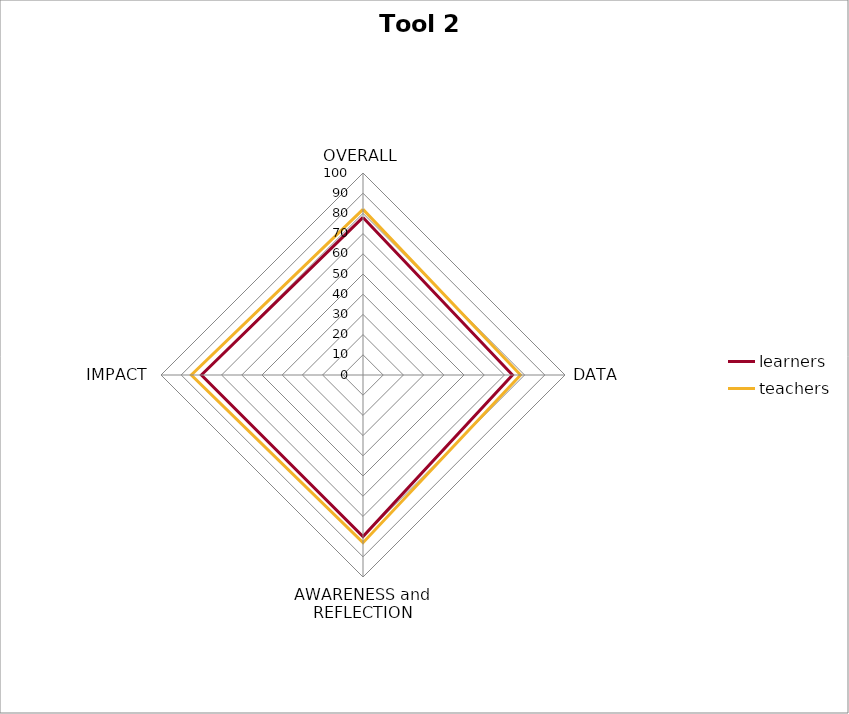
| Category | learners | teachers |
|---|---|---|
| OVERALL | 78 | 82 |
| DATA | 74 | 78 |
| AWARENESS and REFLECTION | 80 | 83 |
| IMPACT | 80 | 85 |